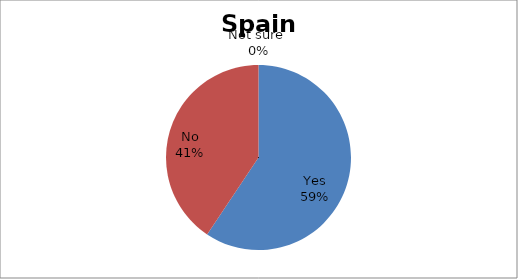
| Category | Series 0 |
|---|---|
| Yes | 19 |
| No | 13 |
| Not sure  | 0 |